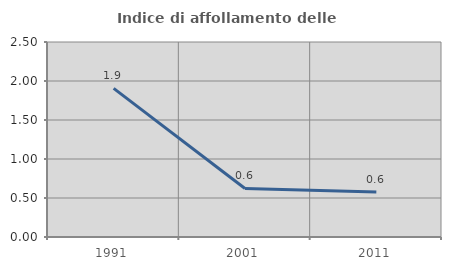
| Category | Indice di affollamento delle abitazioni  |
|---|---|
| 1991.0 | 1.905 |
| 2001.0 | 0.622 |
| 2011.0 | 0.577 |